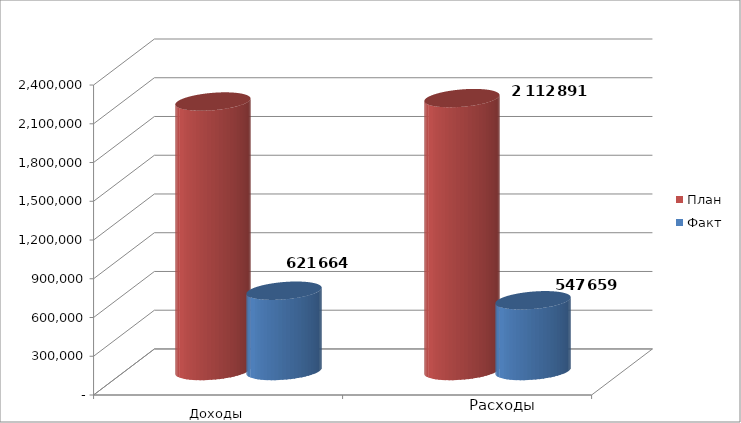
| Category | План | Факт |
|---|---|---|
| 0 | 2086486 | 621664 |
| 1 | 2112891 | 547658.5 |